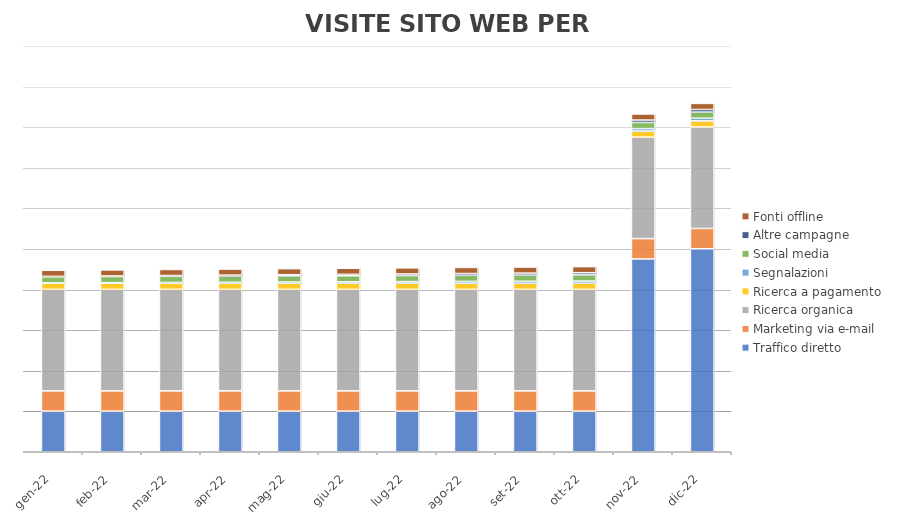
| Category | Traffico diretto | Marketing via e-mail | Ricerca organica | Ricerca a pagamento | Segnalazioni | Social media | Altre campagne | Fonti offline |
|---|---|---|---|---|---|---|---|---|
| 2022-01-18 | 200 | 100 | 500 | 30 | 2 | 30 | 2 | 30 |
| 2022-02-18 | 200 | 100 | 500 | 30 | 3 | 30 | 3 | 30 |
| 2022-03-18 | 200 | 100 | 500 | 30 | 4 | 30 | 4 | 30 |
| 2022-04-18 | 200 | 100 | 500 | 30 | 5 | 30 | 5 | 30 |
| 2022-05-18 | 200 | 100 | 500 | 30 | 6 | 30 | 6 | 30 |
| 2022-06-18 | 200 | 100 | 500 | 30 | 7 | 30 | 7 | 30 |
| 2022-07-18 | 200 | 100 | 500 | 30 | 8 | 30 | 8 | 30 |
| 2022-08-18 | 200 | 100 | 500 | 30 | 9 | 30 | 9 | 30 |
| 2022-09-18 | 200 | 100 | 500 | 30 | 10 | 30 | 10 | 30 |
| 2022-10-18 | 200 | 100 | 500 | 30 | 11 | 30 | 11 | 30 |
| 2022-11-18 | 950 | 100 | 500 | 30 | 12 | 30 | 12 | 30 |
| 2022-12-18 | 1000 | 100 | 500 | 30 | 13 | 30 | 13 | 30 |